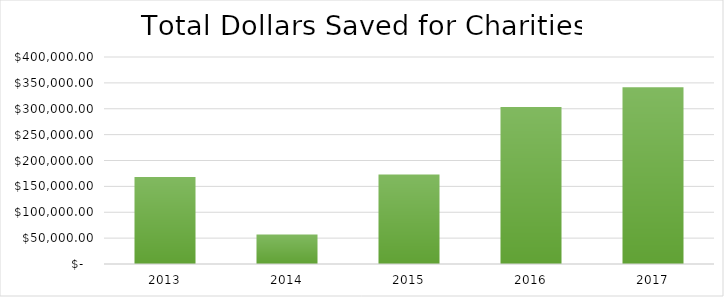
| Category | Series 0 |
|---|---|
| 2013.0 | 168230.013 |
| 2014.0 | 57012.464 |
| 2015.0 | 173075.405 |
| 2016.0 | 303585.889 |
| 2017.0 | 341454.013 |